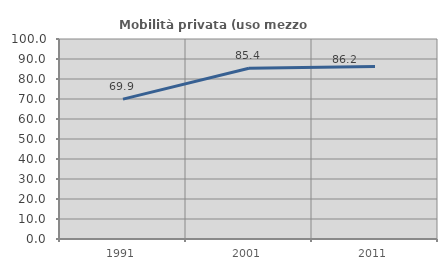
| Category | Mobilità privata (uso mezzo privato) |
|---|---|
| 1991.0 | 69.938 |
| 2001.0 | 85.382 |
| 2011.0 | 86.197 |